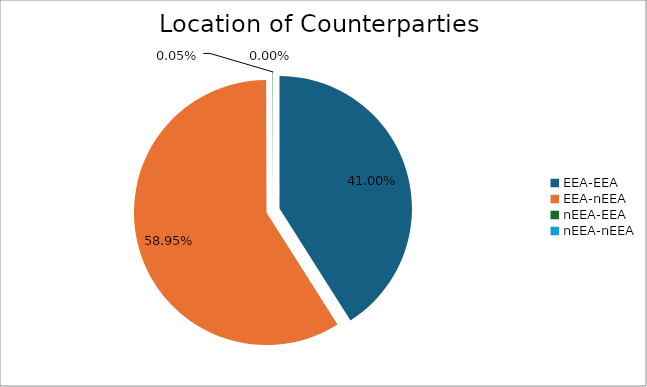
| Category | Series 0 |
|---|---|
| EEA-EEA | 5348319.269 |
| EEA-nEEA | 7689539.438 |
| nEEA-EEA | 6067.1 |
| nEEA-nEEA | 405.854 |